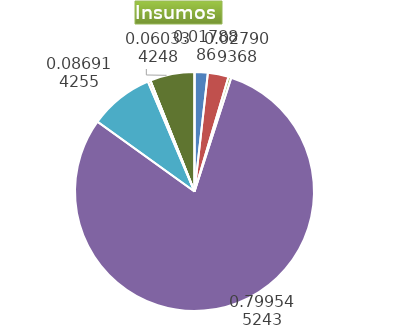
| Category | Series 0 |
|---|---|
| Control arvenses | 835380 |
| Control fitosanitario | 1303340 |
| Cosecha y beneficio | 182759.745 |
| Fertilización | 37337976 |
| Instalación | 4058810.153 |
| Otros | 163200 |
| Podas | 0 |
| Riego | 0 |
| Transporte | 2817550 |
| Tutorado | 0 |